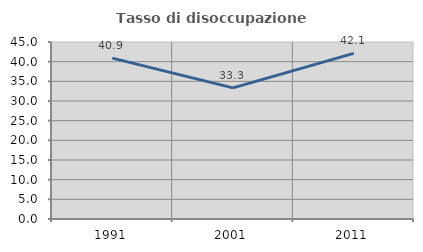
| Category | Tasso di disoccupazione giovanile  |
|---|---|
| 1991.0 | 40.909 |
| 2001.0 | 33.333 |
| 2011.0 | 42.105 |